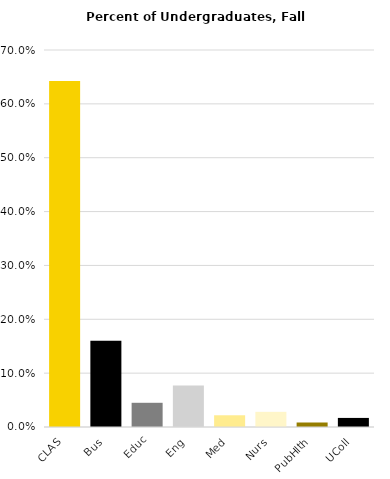
| Category | Series 0 |
|---|---|
| CLAS | 0.643 |
| Bus | 0.16 |
| Educ | 0.045 |
| Eng | 0.077 |
| Med | 0.022 |
| Nurs | 0.028 |
| PubHlth | 0.008 |
| UColl | 0.017 |